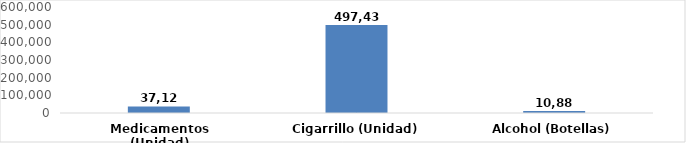
| Category | Series 0 |
|---|---|
| Medicamentos (Unidad) | 37128 |
| Cigarrillo (Unidad) | 497435 |
| Alcohol (Botellas) | 10885 |